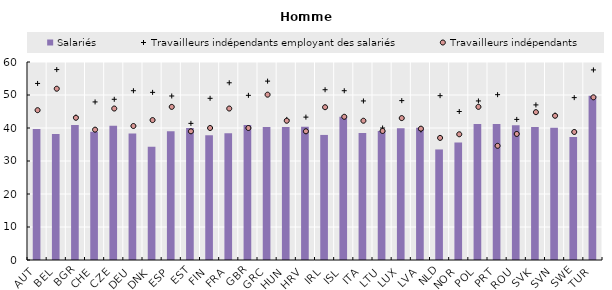
| Category | Salariés |
|---|---|
| AUT | 39.7 |
| BEL | 38.2 |
| BGR | 40.9 |
| CHE | 38.9 |
| CZE | 40.7 |
| DEU | 38.3 |
| DNK | 34.3 |
| ESP | 39 |
| EST | 40 |
| FIN | 37.8 |
| FRA | 38.4 |
| GBR | 40.9 |
| GRC | 40.3 |
| HUN | 40.3 |
| HRV | 40.4 |
| IRL | 37.9 |
| ISL | 43.4 |
| ITA | 38.5 |
| LTU | 39.1 |
| LUX | 39.9 |
| LVA | 40.1 |
| NLD | 33.5 |
| NOR | 35.6 |
| POL | 41.2 |
| PRT | 41.2 |
| ROU | 40.8 |
| SVK | 40.3 |
| SVN | 40.1 |
| SWE | 37.3 |
| TUR | 49.8 |